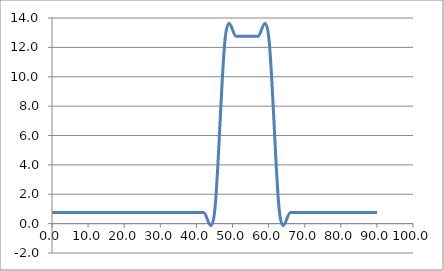
| Category | Elevation (in.) |
|---|---|
| 0.024 | 0.75 |
| 3.024 | 0.75 |
| 6.048 | 0.75 |
| 9.024000000000001 | 0.75 |
| 12.024000000000001 | 0.75 |
| 15.024000000000001 | 0.75 |
| 18.024 | 0.75 |
| 21.024 | 0.75 |
| 24.023999999999997 | 0.75 |
| 27.023999999999997 | 0.75 |
| 30.023999999999997 | 0.75 |
| 33.024 | 0.75 |
| 36.024 | 0.75 |
| 39.024 | 0.75 |
| 42.024 | 0.75 |
| 45.024 | 0.75 |
| 48.024 | 12.75 |
| 51.024 | 12.75 |
| 54.024 | 12.75 |
| 57.024 | 12.75 |
| 60.024 | 12.75 |
| 63.024 | 0.75 |
| 66.024 | 0.75 |
| 69.024 | 0.75 |
| 72.048 | 0.75 |
| 75.024 | 0.75 |
| 78.048 | 0.75 |
| 81.024 | 0.75 |
| 84.024 | 0.75 |
| 87.024 | 0.75 |
| 90.024 | 0.75 |